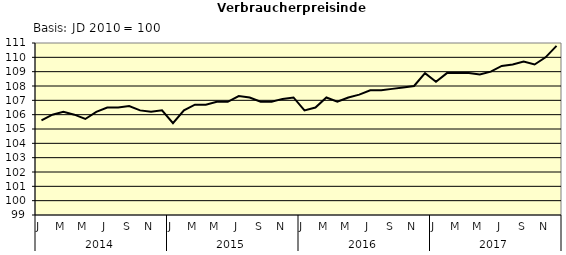
| Category | Series 0 |
|---|---|
| 0 | 105.6 |
| 1 | 106 |
| 2 | 106.2 |
| 3 | 106 |
| 4 | 105.7 |
| 5 | 106.2 |
| 6 | 106.5 |
| 7 | 106.5 |
| 8 | 106.6 |
| 9 | 106.3 |
| 10 | 106.2 |
| 11 | 106.3 |
| 12 | 105.4 |
| 13 | 106.3 |
| 14 | 106.7 |
| 15 | 106.7 |
| 16 | 106.9 |
| 17 | 106.9 |
| 18 | 107.3 |
| 19 | 107.2 |
| 20 | 106.9 |
| 21 | 106.9 |
| 22 | 107.1 |
| 23 | 107.2 |
| 24 | 106.3 |
| 25 | 106.5 |
| 26 | 107.2 |
| 27 | 106.9 |
| 28 | 107.2 |
| 29 | 107.4 |
| 30 | 107.7 |
| 31 | 107.7 |
| 32 | 107.8 |
| 33 | 107.9 |
| 34 | 108 |
| 35 | 108.9 |
| 36 | 108.3 |
| 37 | 108.9 |
| 38 | 108.9 |
| 39 | 108.9 |
| 40 | 108.8 |
| 41 | 109 |
| 42 | 109.4 |
| 43 | 109.5 |
| 44 | 109.7 |
| 45 | 109.5 |
| 46 | 110 |
| 47 | 110.8 |